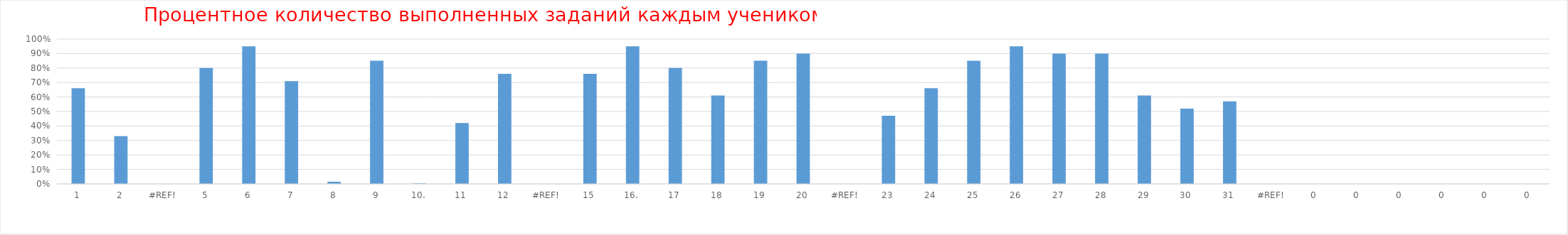
| Category | Series 0 |
|---|---|
| 1 | 0.66 |
| 2 | 0.33 |
| #ССЫЛКА! | 0 |
| 5 | 0.8 |
| 6 | 0.95 |
| 7 | 0.71 |
| 8 | 0.015 |
| 9 | 0.85 |
| 10. | 0.004 |
| 11 | 0.42 |
| 12 | 0.76 |
| #ССЫЛКА! | 0 |
| 15 | 0.76 |
| 16. | 0.95 |
| 17 | 0.8 |
| 18 | 0.61 |
| 19 | 0.85 |
| 20 | 0.9 |
| #ССЫЛКА! | 0 |
| 23 | 0.47 |
| 24 | 0.66 |
| 25 | 0.85 |
| 26 | 0.95 |
| 27 | 0.9 |
| 28 | 0.9 |
| 29 | 0.61 |
| 30 | 0.52 |
| 31 | 0.57 |
| #ССЫЛКА! | 0 |
| 0 | 0 |
| 0 | 0 |
| 0 | 0 |
| 0 | 0 |
| 0 | 0 |
| 0 | 0 |